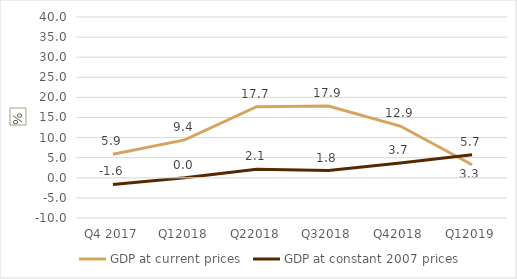
| Category | GDP at current prices  | GDP at constant 2007 prices |
|---|---|---|
| Q4 2017 | 5.853 | -1.641 |
| Q12018 | 9.421 | 0.025 |
| Q22018 | 17.696 | 2.134 |
| Q32018 | 17.875 | 1.806 |
| Q42018 | 12.876 | 3.698 |
| Q12019 | 3.252 | 5.715 |